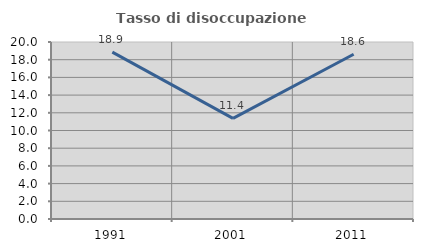
| Category | Tasso di disoccupazione giovanile  |
|---|---|
| 1991.0 | 18.856 |
| 2001.0 | 11.364 |
| 2011.0 | 18.613 |